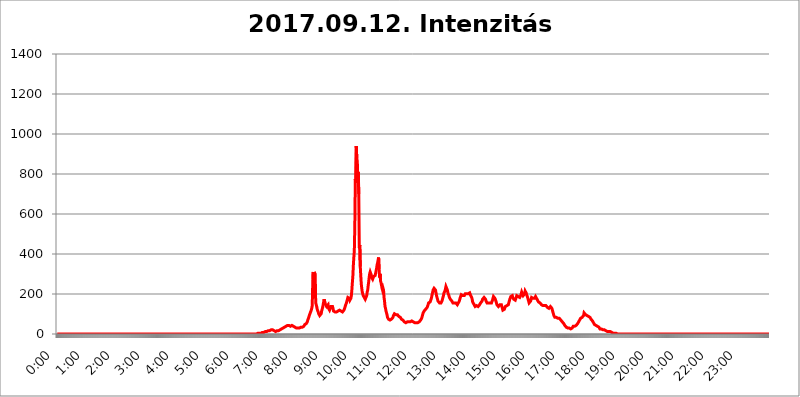
| Category | 2017.09.12. Intenzitás [W/m^2] |
|---|---|
| 0.0 | 0 |
| 0.0006944444444444445 | 0 |
| 0.001388888888888889 | 0 |
| 0.0020833333333333333 | 0 |
| 0.002777777777777778 | 0 |
| 0.003472222222222222 | 0 |
| 0.004166666666666667 | 0 |
| 0.004861111111111111 | 0 |
| 0.005555555555555556 | 0 |
| 0.0062499999999999995 | 0 |
| 0.006944444444444444 | 0 |
| 0.007638888888888889 | 0 |
| 0.008333333333333333 | 0 |
| 0.009027777777777779 | 0 |
| 0.009722222222222222 | 0 |
| 0.010416666666666666 | 0 |
| 0.011111111111111112 | 0 |
| 0.011805555555555555 | 0 |
| 0.012499999999999999 | 0 |
| 0.013194444444444444 | 0 |
| 0.013888888888888888 | 0 |
| 0.014583333333333332 | 0 |
| 0.015277777777777777 | 0 |
| 0.015972222222222224 | 0 |
| 0.016666666666666666 | 0 |
| 0.017361111111111112 | 0 |
| 0.018055555555555557 | 0 |
| 0.01875 | 0 |
| 0.019444444444444445 | 0 |
| 0.02013888888888889 | 0 |
| 0.020833333333333332 | 0 |
| 0.02152777777777778 | 0 |
| 0.022222222222222223 | 0 |
| 0.02291666666666667 | 0 |
| 0.02361111111111111 | 0 |
| 0.024305555555555556 | 0 |
| 0.024999999999999998 | 0 |
| 0.025694444444444447 | 0 |
| 0.02638888888888889 | 0 |
| 0.027083333333333334 | 0 |
| 0.027777777777777776 | 0 |
| 0.02847222222222222 | 0 |
| 0.029166666666666664 | 0 |
| 0.029861111111111113 | 0 |
| 0.030555555555555555 | 0 |
| 0.03125 | 0 |
| 0.03194444444444445 | 0 |
| 0.03263888888888889 | 0 |
| 0.03333333333333333 | 0 |
| 0.034027777777777775 | 0 |
| 0.034722222222222224 | 0 |
| 0.035416666666666666 | 0 |
| 0.036111111111111115 | 0 |
| 0.03680555555555556 | 0 |
| 0.0375 | 0 |
| 0.03819444444444444 | 0 |
| 0.03888888888888889 | 0 |
| 0.03958333333333333 | 0 |
| 0.04027777777777778 | 0 |
| 0.04097222222222222 | 0 |
| 0.041666666666666664 | 0 |
| 0.042361111111111106 | 0 |
| 0.04305555555555556 | 0 |
| 0.043750000000000004 | 0 |
| 0.044444444444444446 | 0 |
| 0.04513888888888889 | 0 |
| 0.04583333333333334 | 0 |
| 0.04652777777777778 | 0 |
| 0.04722222222222222 | 0 |
| 0.04791666666666666 | 0 |
| 0.04861111111111111 | 0 |
| 0.049305555555555554 | 0 |
| 0.049999999999999996 | 0 |
| 0.05069444444444445 | 0 |
| 0.051388888888888894 | 0 |
| 0.052083333333333336 | 0 |
| 0.05277777777777778 | 0 |
| 0.05347222222222222 | 0 |
| 0.05416666666666667 | 0 |
| 0.05486111111111111 | 0 |
| 0.05555555555555555 | 0 |
| 0.05625 | 0 |
| 0.05694444444444444 | 0 |
| 0.057638888888888885 | 0 |
| 0.05833333333333333 | 0 |
| 0.05902777777777778 | 0 |
| 0.059722222222222225 | 0 |
| 0.06041666666666667 | 0 |
| 0.061111111111111116 | 0 |
| 0.06180555555555556 | 0 |
| 0.0625 | 0 |
| 0.06319444444444444 | 0 |
| 0.06388888888888888 | 0 |
| 0.06458333333333334 | 0 |
| 0.06527777777777778 | 0 |
| 0.06597222222222222 | 0 |
| 0.06666666666666667 | 0 |
| 0.06736111111111111 | 0 |
| 0.06805555555555555 | 0 |
| 0.06874999999999999 | 0 |
| 0.06944444444444443 | 0 |
| 0.07013888888888889 | 0 |
| 0.07083333333333333 | 0 |
| 0.07152777777777779 | 0 |
| 0.07222222222222223 | 0 |
| 0.07291666666666667 | 0 |
| 0.07361111111111111 | 0 |
| 0.07430555555555556 | 0 |
| 0.075 | 0 |
| 0.07569444444444444 | 0 |
| 0.0763888888888889 | 0 |
| 0.07708333333333334 | 0 |
| 0.07777777777777778 | 0 |
| 0.07847222222222222 | 0 |
| 0.07916666666666666 | 0 |
| 0.0798611111111111 | 0 |
| 0.08055555555555556 | 0 |
| 0.08125 | 0 |
| 0.08194444444444444 | 0 |
| 0.08263888888888889 | 0 |
| 0.08333333333333333 | 0 |
| 0.08402777777777777 | 0 |
| 0.08472222222222221 | 0 |
| 0.08541666666666665 | 0 |
| 0.08611111111111112 | 0 |
| 0.08680555555555557 | 0 |
| 0.08750000000000001 | 0 |
| 0.08819444444444445 | 0 |
| 0.08888888888888889 | 0 |
| 0.08958333333333333 | 0 |
| 0.09027777777777778 | 0 |
| 0.09097222222222222 | 0 |
| 0.09166666666666667 | 0 |
| 0.09236111111111112 | 0 |
| 0.09305555555555556 | 0 |
| 0.09375 | 0 |
| 0.09444444444444444 | 0 |
| 0.09513888888888888 | 0 |
| 0.09583333333333333 | 0 |
| 0.09652777777777777 | 0 |
| 0.09722222222222222 | 0 |
| 0.09791666666666667 | 0 |
| 0.09861111111111111 | 0 |
| 0.09930555555555555 | 0 |
| 0.09999999999999999 | 0 |
| 0.10069444444444443 | 0 |
| 0.1013888888888889 | 0 |
| 0.10208333333333335 | 0 |
| 0.10277777777777779 | 0 |
| 0.10347222222222223 | 0 |
| 0.10416666666666667 | 0 |
| 0.10486111111111111 | 0 |
| 0.10555555555555556 | 0 |
| 0.10625 | 0 |
| 0.10694444444444444 | 0 |
| 0.1076388888888889 | 0 |
| 0.10833333333333334 | 0 |
| 0.10902777777777778 | 0 |
| 0.10972222222222222 | 0 |
| 0.1111111111111111 | 0 |
| 0.11180555555555556 | 0 |
| 0.11180555555555556 | 0 |
| 0.1125 | 0 |
| 0.11319444444444444 | 0 |
| 0.11388888888888889 | 0 |
| 0.11458333333333333 | 0 |
| 0.11527777777777777 | 0 |
| 0.11597222222222221 | 0 |
| 0.11666666666666665 | 0 |
| 0.1173611111111111 | 0 |
| 0.11805555555555557 | 0 |
| 0.11944444444444445 | 0 |
| 0.12013888888888889 | 0 |
| 0.12083333333333333 | 0 |
| 0.12152777777777778 | 0 |
| 0.12222222222222223 | 0 |
| 0.12291666666666667 | 0 |
| 0.12291666666666667 | 0 |
| 0.12361111111111112 | 0 |
| 0.12430555555555556 | 0 |
| 0.125 | 0 |
| 0.12569444444444444 | 0 |
| 0.12638888888888888 | 0 |
| 0.12708333333333333 | 0 |
| 0.16875 | 0 |
| 0.12847222222222224 | 0 |
| 0.12916666666666668 | 0 |
| 0.12986111111111112 | 0 |
| 0.13055555555555556 | 0 |
| 0.13125 | 0 |
| 0.13194444444444445 | 0 |
| 0.1326388888888889 | 0 |
| 0.13333333333333333 | 0 |
| 0.13402777777777777 | 0 |
| 0.13402777777777777 | 0 |
| 0.13472222222222222 | 0 |
| 0.13541666666666666 | 0 |
| 0.1361111111111111 | 0 |
| 0.13749999999999998 | 0 |
| 0.13819444444444443 | 0 |
| 0.1388888888888889 | 0 |
| 0.13958333333333334 | 0 |
| 0.14027777777777778 | 0 |
| 0.14097222222222222 | 0 |
| 0.14166666666666666 | 0 |
| 0.1423611111111111 | 0 |
| 0.14305555555555557 | 0 |
| 0.14375000000000002 | 0 |
| 0.14444444444444446 | 0 |
| 0.1451388888888889 | 0 |
| 0.1451388888888889 | 0 |
| 0.14652777777777778 | 0 |
| 0.14722222222222223 | 0 |
| 0.14791666666666667 | 0 |
| 0.1486111111111111 | 0 |
| 0.14930555555555555 | 0 |
| 0.15 | 0 |
| 0.15069444444444444 | 0 |
| 0.15138888888888888 | 0 |
| 0.15208333333333332 | 0 |
| 0.15277777777777776 | 0 |
| 0.15347222222222223 | 0 |
| 0.15416666666666667 | 0 |
| 0.15486111111111112 | 0 |
| 0.15555555555555556 | 0 |
| 0.15625 | 0 |
| 0.15694444444444444 | 0 |
| 0.15763888888888888 | 0 |
| 0.15833333333333333 | 0 |
| 0.15902777777777777 | 0 |
| 0.15972222222222224 | 0 |
| 0.16041666666666668 | 0 |
| 0.16111111111111112 | 0 |
| 0.16180555555555556 | 0 |
| 0.1625 | 0 |
| 0.16319444444444445 | 0 |
| 0.1638888888888889 | 0 |
| 0.16458333333333333 | 0 |
| 0.16527777777777777 | 0 |
| 0.16597222222222222 | 0 |
| 0.16666666666666666 | 0 |
| 0.1673611111111111 | 0 |
| 0.16805555555555554 | 0 |
| 0.16874999999999998 | 0 |
| 0.16944444444444443 | 0 |
| 0.17013888888888887 | 0 |
| 0.1708333333333333 | 0 |
| 0.17152777777777775 | 0 |
| 0.17222222222222225 | 0 |
| 0.1729166666666667 | 0 |
| 0.17361111111111113 | 0 |
| 0.17430555555555557 | 0 |
| 0.17500000000000002 | 0 |
| 0.17569444444444446 | 0 |
| 0.1763888888888889 | 0 |
| 0.17708333333333334 | 0 |
| 0.17777777777777778 | 0 |
| 0.17847222222222223 | 0 |
| 0.17916666666666667 | 0 |
| 0.1798611111111111 | 0 |
| 0.18055555555555555 | 0 |
| 0.18125 | 0 |
| 0.18194444444444444 | 0 |
| 0.1826388888888889 | 0 |
| 0.18333333333333335 | 0 |
| 0.1840277777777778 | 0 |
| 0.18472222222222223 | 0 |
| 0.18541666666666667 | 0 |
| 0.18611111111111112 | 0 |
| 0.18680555555555556 | 0 |
| 0.1875 | 0 |
| 0.18819444444444444 | 0 |
| 0.18888888888888888 | 0 |
| 0.18958333333333333 | 0 |
| 0.19027777777777777 | 0 |
| 0.1909722222222222 | 0 |
| 0.19166666666666665 | 0 |
| 0.19236111111111112 | 0 |
| 0.19305555555555554 | 0 |
| 0.19375 | 0 |
| 0.19444444444444445 | 0 |
| 0.1951388888888889 | 0 |
| 0.19583333333333333 | 0 |
| 0.19652777777777777 | 0 |
| 0.19722222222222222 | 0 |
| 0.19791666666666666 | 0 |
| 0.1986111111111111 | 0 |
| 0.19930555555555554 | 0 |
| 0.19999999999999998 | 0 |
| 0.20069444444444443 | 0 |
| 0.20138888888888887 | 0 |
| 0.2020833333333333 | 0 |
| 0.2027777777777778 | 0 |
| 0.2034722222222222 | 0 |
| 0.2041666666666667 | 0 |
| 0.20486111111111113 | 0 |
| 0.20555555555555557 | 0 |
| 0.20625000000000002 | 0 |
| 0.20694444444444446 | 0 |
| 0.2076388888888889 | 0 |
| 0.20833333333333334 | 0 |
| 0.20902777777777778 | 0 |
| 0.20972222222222223 | 0 |
| 0.21041666666666667 | 0 |
| 0.2111111111111111 | 0 |
| 0.21180555555555555 | 0 |
| 0.2125 | 0 |
| 0.21319444444444444 | 0 |
| 0.2138888888888889 | 0 |
| 0.21458333333333335 | 0 |
| 0.2152777777777778 | 0 |
| 0.21597222222222223 | 0 |
| 0.21666666666666667 | 0 |
| 0.21736111111111112 | 0 |
| 0.21805555555555556 | 0 |
| 0.21875 | 0 |
| 0.21944444444444444 | 0 |
| 0.22013888888888888 | 0 |
| 0.22083333333333333 | 0 |
| 0.22152777777777777 | 0 |
| 0.2222222222222222 | 0 |
| 0.22291666666666665 | 0 |
| 0.2236111111111111 | 0 |
| 0.22430555555555556 | 0 |
| 0.225 | 0 |
| 0.22569444444444445 | 0 |
| 0.2263888888888889 | 0 |
| 0.22708333333333333 | 0 |
| 0.22777777777777777 | 0 |
| 0.22847222222222222 | 0 |
| 0.22916666666666666 | 0 |
| 0.2298611111111111 | 0 |
| 0.23055555555555554 | 0 |
| 0.23124999999999998 | 0 |
| 0.23194444444444443 | 0 |
| 0.23263888888888887 | 0 |
| 0.2333333333333333 | 0 |
| 0.2340277777777778 | 0 |
| 0.2347222222222222 | 0 |
| 0.2354166666666667 | 0 |
| 0.23611111111111113 | 0 |
| 0.23680555555555557 | 0 |
| 0.23750000000000002 | 0 |
| 0.23819444444444446 | 0 |
| 0.2388888888888889 | 0 |
| 0.23958333333333334 | 0 |
| 0.24027777777777778 | 0 |
| 0.24097222222222223 | 0 |
| 0.24166666666666667 | 0 |
| 0.2423611111111111 | 0 |
| 0.24305555555555555 | 0 |
| 0.24375 | 0 |
| 0.24444444444444446 | 0 |
| 0.24513888888888888 | 0 |
| 0.24583333333333335 | 0 |
| 0.2465277777777778 | 0 |
| 0.24722222222222223 | 0 |
| 0.24791666666666667 | 0 |
| 0.24861111111111112 | 0 |
| 0.24930555555555556 | 0 |
| 0.25 | 0 |
| 0.25069444444444444 | 0 |
| 0.2513888888888889 | 0 |
| 0.2520833333333333 | 0 |
| 0.25277777777777777 | 0 |
| 0.2534722222222222 | 0 |
| 0.25416666666666665 | 0 |
| 0.2548611111111111 | 0 |
| 0.2555555555555556 | 0 |
| 0.25625000000000003 | 0 |
| 0.2569444444444445 | 0 |
| 0.2576388888888889 | 0 |
| 0.25833333333333336 | 0 |
| 0.2590277777777778 | 0 |
| 0.25972222222222224 | 0 |
| 0.2604166666666667 | 0 |
| 0.2611111111111111 | 0 |
| 0.26180555555555557 | 0 |
| 0.2625 | 0 |
| 0.26319444444444445 | 0 |
| 0.2638888888888889 | 0 |
| 0.26458333333333334 | 0 |
| 0.2652777777777778 | 0 |
| 0.2659722222222222 | 0 |
| 0.26666666666666666 | 0 |
| 0.2673611111111111 | 0 |
| 0.26805555555555555 | 0 |
| 0.26875 | 0 |
| 0.26944444444444443 | 0 |
| 0.2701388888888889 | 0 |
| 0.2708333333333333 | 0 |
| 0.27152777777777776 | 0 |
| 0.2722222222222222 | 0 |
| 0.27291666666666664 | 0 |
| 0.2736111111111111 | 0 |
| 0.2743055555555555 | 0 |
| 0.27499999999999997 | 0 |
| 0.27569444444444446 | 0 |
| 0.27638888888888885 | 0 |
| 0.27708333333333335 | 0 |
| 0.2777777777777778 | 0 |
| 0.27847222222222223 | 3.525 |
| 0.2791666666666667 | 0 |
| 0.2798611111111111 | 3.525 |
| 0.28055555555555556 | 3.525 |
| 0.28125 | 3.525 |
| 0.28194444444444444 | 3.525 |
| 0.2826388888888889 | 3.525 |
| 0.2833333333333333 | 3.525 |
| 0.28402777777777777 | 3.525 |
| 0.2847222222222222 | 3.525 |
| 0.28541666666666665 | 3.525 |
| 0.28611111111111115 | 7.887 |
| 0.28680555555555554 | 7.887 |
| 0.28750000000000003 | 7.887 |
| 0.2881944444444445 | 7.887 |
| 0.2888888888888889 | 7.887 |
| 0.28958333333333336 | 7.887 |
| 0.2902777777777778 | 12.257 |
| 0.29097222222222224 | 12.257 |
| 0.2916666666666667 | 12.257 |
| 0.2923611111111111 | 12.257 |
| 0.29305555555555557 | 12.257 |
| 0.29375 | 12.257 |
| 0.29444444444444445 | 12.257 |
| 0.2951388888888889 | 12.257 |
| 0.29583333333333334 | 16.636 |
| 0.2965277777777778 | 16.636 |
| 0.2972222222222222 | 16.636 |
| 0.29791666666666666 | 16.636 |
| 0.2986111111111111 | 21.024 |
| 0.29930555555555555 | 21.024 |
| 0.3 | 21.024 |
| 0.30069444444444443 | 21.024 |
| 0.3013888888888889 | 21.024 |
| 0.3020833333333333 | 21.024 |
| 0.30277777777777776 | 21.024 |
| 0.3034722222222222 | 16.636 |
| 0.30416666666666664 | 16.636 |
| 0.3048611111111111 | 16.636 |
| 0.3055555555555555 | 12.257 |
| 0.30624999999999997 | 12.257 |
| 0.3069444444444444 | 12.257 |
| 0.3076388888888889 | 12.257 |
| 0.30833333333333335 | 16.636 |
| 0.3090277777777778 | 16.636 |
| 0.30972222222222223 | 16.636 |
| 0.3104166666666667 | 16.636 |
| 0.3111111111111111 | 16.636 |
| 0.31180555555555556 | 21.024 |
| 0.3125 | 21.024 |
| 0.31319444444444444 | 21.024 |
| 0.3138888888888889 | 21.024 |
| 0.3145833333333333 | 25.419 |
| 0.31527777777777777 | 25.419 |
| 0.3159722222222222 | 29.823 |
| 0.31666666666666665 | 29.823 |
| 0.31736111111111115 | 29.823 |
| 0.31805555555555554 | 34.234 |
| 0.31875000000000003 | 34.234 |
| 0.3194444444444445 | 38.653 |
| 0.3201388888888889 | 38.653 |
| 0.32083333333333336 | 38.653 |
| 0.3215277777777778 | 38.653 |
| 0.32222222222222224 | 38.653 |
| 0.3229166666666667 | 43.079 |
| 0.3236111111111111 | 43.079 |
| 0.32430555555555557 | 43.079 |
| 0.325 | 43.079 |
| 0.32569444444444445 | 43.079 |
| 0.3263888888888889 | 38.653 |
| 0.32708333333333334 | 38.653 |
| 0.3277777777777778 | 38.653 |
| 0.3284722222222222 | 43.079 |
| 0.32916666666666666 | 43.079 |
| 0.3298611111111111 | 47.511 |
| 0.33055555555555555 | 43.079 |
| 0.33125 | 38.653 |
| 0.33194444444444443 | 38.653 |
| 0.3326388888888889 | 38.653 |
| 0.3333333333333333 | 34.234 |
| 0.3340277777777778 | 34.234 |
| 0.3347222222222222 | 34.234 |
| 0.3354166666666667 | 29.823 |
| 0.3361111111111111 | 29.823 |
| 0.3368055555555556 | 29.823 |
| 0.33749999999999997 | 29.823 |
| 0.33819444444444446 | 25.419 |
| 0.33888888888888885 | 25.419 |
| 0.33958333333333335 | 29.823 |
| 0.34027777777777773 | 29.823 |
| 0.34097222222222223 | 34.234 |
| 0.3416666666666666 | 34.234 |
| 0.3423611111111111 | 34.234 |
| 0.3430555555555555 | 34.234 |
| 0.34375 | 34.234 |
| 0.3444444444444445 | 34.234 |
| 0.3451388888888889 | 38.653 |
| 0.3458333333333334 | 38.653 |
| 0.34652777777777777 | 43.079 |
| 0.34722222222222227 | 47.511 |
| 0.34791666666666665 | 47.511 |
| 0.34861111111111115 | 47.511 |
| 0.34930555555555554 | 51.951 |
| 0.35000000000000003 | 56.398 |
| 0.3506944444444444 | 60.85 |
| 0.3513888888888889 | 69.775 |
| 0.3520833333333333 | 74.246 |
| 0.3527777777777778 | 83.205 |
| 0.3534722222222222 | 92.184 |
| 0.3541666666666667 | 96.682 |
| 0.3548611111111111 | 105.69 |
| 0.35555555555555557 | 110.201 |
| 0.35625 | 119.235 |
| 0.35694444444444445 | 128.284 |
| 0.3576388888888889 | 141.884 |
| 0.35833333333333334 | 255.813 |
| 0.3590277777777778 | 310.44 |
| 0.3597222222222222 | 182.82 |
| 0.36041666666666666 | 310.44 |
| 0.3611111111111111 | 305.898 |
| 0.36180555555555555 | 296.808 |
| 0.3625 | 155.509 |
| 0.36319444444444443 | 146.423 |
| 0.3638888888888889 | 137.347 |
| 0.3645833333333333 | 123.758 |
| 0.3652777777777778 | 119.235 |
| 0.3659722222222222 | 110.201 |
| 0.3666666666666667 | 101.184 |
| 0.3673611111111111 | 101.184 |
| 0.3680555555555556 | 92.184 |
| 0.36874999999999997 | 92.184 |
| 0.36944444444444446 | 96.682 |
| 0.37013888888888885 | 101.184 |
| 0.37083333333333335 | 114.716 |
| 0.37152777777777773 | 123.758 |
| 0.37222222222222223 | 132.814 |
| 0.3729166666666666 | 146.423 |
| 0.3736111111111111 | 160.056 |
| 0.3743055555555555 | 173.709 |
| 0.375 | 164.605 |
| 0.3756944444444445 | 155.509 |
| 0.3763888888888889 | 146.423 |
| 0.3770833333333334 | 141.884 |
| 0.37777777777777777 | 137.347 |
| 0.37847222222222227 | 137.347 |
| 0.37916666666666665 | 141.884 |
| 0.37986111111111115 | 146.423 |
| 0.38055555555555554 | 128.284 |
| 0.38125000000000003 | 123.758 |
| 0.3819444444444444 | 119.235 |
| 0.3826388888888889 | 119.235 |
| 0.3833333333333333 | 123.758 |
| 0.3840277777777778 | 137.347 |
| 0.3847222222222222 | 141.884 |
| 0.3854166666666667 | 141.884 |
| 0.3861111111111111 | 137.347 |
| 0.38680555555555557 | 128.284 |
| 0.3875 | 114.716 |
| 0.38819444444444445 | 110.201 |
| 0.3888888888888889 | 110.201 |
| 0.38958333333333334 | 110.201 |
| 0.3902777777777778 | 110.201 |
| 0.3909722222222222 | 110.201 |
| 0.39166666666666666 | 110.201 |
| 0.3923611111111111 | 114.716 |
| 0.39305555555555555 | 114.716 |
| 0.39375 | 114.716 |
| 0.39444444444444443 | 119.235 |
| 0.3951388888888889 | 119.235 |
| 0.3958333333333333 | 119.235 |
| 0.3965277777777778 | 119.235 |
| 0.3972222222222222 | 114.716 |
| 0.3979166666666667 | 114.716 |
| 0.3986111111111111 | 110.201 |
| 0.3993055555555556 | 110.201 |
| 0.39999999999999997 | 110.201 |
| 0.40069444444444446 | 114.716 |
| 0.40138888888888885 | 114.716 |
| 0.40208333333333335 | 119.235 |
| 0.40277777777777773 | 123.758 |
| 0.40347222222222223 | 132.814 |
| 0.4041666666666666 | 141.884 |
| 0.4048611111111111 | 146.423 |
| 0.4055555555555555 | 155.509 |
| 0.40625 | 160.056 |
| 0.4069444444444445 | 173.709 |
| 0.4076388888888889 | 182.82 |
| 0.4083333333333334 | 187.378 |
| 0.40902777777777777 | 187.378 |
| 0.40972222222222227 | 178.264 |
| 0.41041666666666665 | 169.156 |
| 0.41111111111111115 | 169.156 |
| 0.41180555555555554 | 178.264 |
| 0.41250000000000003 | 191.937 |
| 0.4131944444444444 | 219.309 |
| 0.4138888888888889 | 255.813 |
| 0.4145833333333333 | 287.709 |
| 0.4152777777777778 | 342.162 |
| 0.4159722222222222 | 382.715 |
| 0.4166666666666667 | 418.492 |
| 0.4173611111111111 | 541.121 |
| 0.41805555555555557 | 775.492 |
| 0.41875 | 755.766 |
| 0.41944444444444445 | 940.082 |
| 0.4201388888888889 | 875.918 |
| 0.42083333333333334 | 864.493 |
| 0.4215277777777778 | 775.492 |
| 0.4222222222222222 | 810.641 |
| 0.42291666666666666 | 699.717 |
| 0.4236111111111111 | 431.833 |
| 0.42430555555555555 | 445.129 |
| 0.425 | 337.639 |
| 0.42569444444444443 | 292.259 |
| 0.4263888888888889 | 251.251 |
| 0.4270833333333333 | 228.436 |
| 0.4277777777777778 | 210.182 |
| 0.4284722222222222 | 201.058 |
| 0.4291666666666667 | 191.937 |
| 0.4298611111111111 | 187.378 |
| 0.4305555555555556 | 182.82 |
| 0.43124999999999997 | 178.264 |
| 0.43194444444444446 | 173.709 |
| 0.43263888888888885 | 173.709 |
| 0.43333333333333335 | 178.264 |
| 0.43402777777777773 | 191.937 |
| 0.43472222222222223 | 210.182 |
| 0.4354166666666666 | 219.309 |
| 0.4361111111111111 | 242.127 |
| 0.4368055555555555 | 260.373 |
| 0.4375 | 283.156 |
| 0.4381944444444445 | 301.354 |
| 0.4388888888888889 | 310.44 |
| 0.4395833333333334 | 310.44 |
| 0.44027777777777777 | 296.808 |
| 0.44097222222222227 | 283.156 |
| 0.44166666666666665 | 278.603 |
| 0.44236111111111115 | 274.047 |
| 0.44305555555555554 | 278.603 |
| 0.44375000000000003 | 287.709 |
| 0.4444444444444444 | 292.259 |
| 0.4451388888888889 | 292.259 |
| 0.4458333333333333 | 292.259 |
| 0.4465277777777778 | 292.259 |
| 0.4472222222222222 | 296.808 |
| 0.4479166666666667 | 328.584 |
| 0.4486111111111111 | 346.682 |
| 0.44930555555555557 | 355.712 |
| 0.45 | 369.23 |
| 0.45069444444444445 | 382.715 |
| 0.4513888888888889 | 324.052 |
| 0.45208333333333334 | 283.156 |
| 0.4527777777777778 | 301.354 |
| 0.4534722222222222 | 264.932 |
| 0.45416666666666666 | 255.813 |
| 0.4548611111111111 | 242.127 |
| 0.45555555555555555 | 228.436 |
| 0.45625 | 219.309 |
| 0.45694444444444443 | 228.436 |
| 0.4576388888888889 | 219.309 |
| 0.4583333333333333 | 182.82 |
| 0.4590277777777778 | 164.605 |
| 0.4597222222222222 | 137.347 |
| 0.4604166666666667 | 128.284 |
| 0.4611111111111111 | 114.716 |
| 0.4618055555555556 | 105.69 |
| 0.46249999999999997 | 96.682 |
| 0.46319444444444446 | 83.205 |
| 0.46388888888888885 | 78.722 |
| 0.46458333333333335 | 74.246 |
| 0.46527777777777773 | 69.775 |
| 0.46597222222222223 | 69.775 |
| 0.4666666666666666 | 69.775 |
| 0.4673611111111111 | 69.775 |
| 0.4680555555555555 | 69.775 |
| 0.46875 | 74.246 |
| 0.4694444444444445 | 74.246 |
| 0.4701388888888889 | 78.722 |
| 0.4708333333333334 | 83.205 |
| 0.47152777777777777 | 92.184 |
| 0.47222222222222227 | 96.682 |
| 0.47291666666666665 | 101.184 |
| 0.47361111111111115 | 101.184 |
| 0.47430555555555554 | 101.184 |
| 0.47500000000000003 | 96.682 |
| 0.4756944444444444 | 96.682 |
| 0.4763888888888889 | 96.682 |
| 0.4770833333333333 | 96.682 |
| 0.4777777777777778 | 92.184 |
| 0.4784722222222222 | 92.184 |
| 0.4791666666666667 | 87.692 |
| 0.4798611111111111 | 83.205 |
| 0.48055555555555557 | 83.205 |
| 0.48125 | 83.205 |
| 0.48194444444444445 | 78.722 |
| 0.4826388888888889 | 74.246 |
| 0.48333333333333334 | 74.246 |
| 0.4840277777777778 | 69.775 |
| 0.4847222222222222 | 69.775 |
| 0.48541666666666666 | 65.31 |
| 0.4861111111111111 | 65.31 |
| 0.48680555555555555 | 60.85 |
| 0.4875 | 60.85 |
| 0.48819444444444443 | 60.85 |
| 0.4888888888888889 | 56.398 |
| 0.4895833333333333 | 56.398 |
| 0.4902777777777778 | 60.85 |
| 0.4909722222222222 | 60.85 |
| 0.4916666666666667 | 60.85 |
| 0.4923611111111111 | 60.85 |
| 0.4930555555555556 | 60.85 |
| 0.49374999999999997 | 60.85 |
| 0.49444444444444446 | 60.85 |
| 0.49513888888888885 | 60.85 |
| 0.49583333333333335 | 60.85 |
| 0.49652777777777773 | 65.31 |
| 0.49722222222222223 | 65.31 |
| 0.4979166666666666 | 65.31 |
| 0.4986111111111111 | 60.85 |
| 0.4993055555555555 | 60.85 |
| 0.5 | 60.85 |
| 0.5006944444444444 | 56.398 |
| 0.5013888888888889 | 56.398 |
| 0.5020833333333333 | 56.398 |
| 0.5027777777777778 | 56.398 |
| 0.5034722222222222 | 56.398 |
| 0.5041666666666667 | 56.398 |
| 0.5048611111111111 | 51.951 |
| 0.5055555555555555 | 56.398 |
| 0.50625 | 56.398 |
| 0.5069444444444444 | 56.398 |
| 0.5076388888888889 | 60.85 |
| 0.5083333333333333 | 60.85 |
| 0.5090277777777777 | 65.31 |
| 0.5097222222222222 | 69.775 |
| 0.5104166666666666 | 74.246 |
| 0.5111111111111112 | 78.722 |
| 0.5118055555555555 | 87.692 |
| 0.5125000000000001 | 96.682 |
| 0.5131944444444444 | 105.69 |
| 0.513888888888889 | 110.201 |
| 0.5145833333333333 | 114.716 |
| 0.5152777777777778 | 119.235 |
| 0.5159722222222222 | 119.235 |
| 0.5166666666666667 | 123.758 |
| 0.517361111111111 | 123.758 |
| 0.5180555555555556 | 128.284 |
| 0.5187499999999999 | 132.814 |
| 0.5194444444444445 | 137.347 |
| 0.5201388888888888 | 146.423 |
| 0.5208333333333334 | 155.509 |
| 0.5215277777777778 | 155.509 |
| 0.5222222222222223 | 155.509 |
| 0.5229166666666667 | 160.056 |
| 0.5236111111111111 | 164.605 |
| 0.5243055555555556 | 173.709 |
| 0.525 | 182.82 |
| 0.5256944444444445 | 196.497 |
| 0.5263888888888889 | 205.62 |
| 0.5270833333333333 | 219.309 |
| 0.5277777777777778 | 223.873 |
| 0.5284722222222222 | 228.436 |
| 0.5291666666666667 | 228.436 |
| 0.5298611111111111 | 223.873 |
| 0.5305555555555556 | 219.309 |
| 0.53125 | 205.62 |
| 0.5319444444444444 | 191.937 |
| 0.5326388888888889 | 182.82 |
| 0.5333333333333333 | 173.709 |
| 0.5340277777777778 | 164.605 |
| 0.5347222222222222 | 164.605 |
| 0.5354166666666667 | 160.056 |
| 0.5361111111111111 | 155.509 |
| 0.5368055555555555 | 155.509 |
| 0.5375 | 150.964 |
| 0.5381944444444444 | 155.509 |
| 0.5388888888888889 | 160.056 |
| 0.5395833333333333 | 164.605 |
| 0.5402777777777777 | 173.709 |
| 0.5409722222222222 | 182.82 |
| 0.5416666666666666 | 191.937 |
| 0.5423611111111112 | 205.62 |
| 0.5430555555555555 | 210.182 |
| 0.5437500000000001 | 214.746 |
| 0.5444444444444444 | 219.309 |
| 0.545138888888889 | 237.564 |
| 0.5458333333333333 | 242.127 |
| 0.5465277777777778 | 233 |
| 0.5472222222222222 | 219.309 |
| 0.5479166666666667 | 205.62 |
| 0.548611111111111 | 201.058 |
| 0.5493055555555556 | 191.937 |
| 0.5499999999999999 | 182.82 |
| 0.5506944444444445 | 178.264 |
| 0.5513888888888888 | 173.709 |
| 0.5520833333333334 | 173.709 |
| 0.5527777777777778 | 169.156 |
| 0.5534722222222223 | 164.605 |
| 0.5541666666666667 | 160.056 |
| 0.5548611111111111 | 155.509 |
| 0.5555555555555556 | 155.509 |
| 0.55625 | 155.509 |
| 0.5569444444444445 | 155.509 |
| 0.5576388888888889 | 160.056 |
| 0.5583333333333333 | 160.056 |
| 0.5590277777777778 | 155.509 |
| 0.5597222222222222 | 150.964 |
| 0.5604166666666667 | 150.964 |
| 0.5611111111111111 | 146.423 |
| 0.5618055555555556 | 150.964 |
| 0.5625 | 155.509 |
| 0.5631944444444444 | 160.056 |
| 0.5638888888888889 | 164.605 |
| 0.5645833333333333 | 173.709 |
| 0.5652777777777778 | 182.82 |
| 0.5659722222222222 | 187.378 |
| 0.5666666666666667 | 196.497 |
| 0.5673611111111111 | 201.058 |
| 0.5680555555555555 | 196.497 |
| 0.56875 | 191.937 |
| 0.5694444444444444 | 187.378 |
| 0.5701388888888889 | 187.378 |
| 0.5708333333333333 | 191.937 |
| 0.5715277777777777 | 196.497 |
| 0.5722222222222222 | 201.058 |
| 0.5729166666666666 | 201.058 |
| 0.5736111111111112 | 201.058 |
| 0.5743055555555555 | 201.058 |
| 0.5750000000000001 | 205.62 |
| 0.5756944444444444 | 205.62 |
| 0.576388888888889 | 201.058 |
| 0.5770833333333333 | 196.497 |
| 0.5777777777777778 | 201.058 |
| 0.5784722222222222 | 205.62 |
| 0.5791666666666667 | 201.058 |
| 0.579861111111111 | 191.937 |
| 0.5805555555555556 | 191.937 |
| 0.5812499999999999 | 182.82 |
| 0.5819444444444445 | 173.709 |
| 0.5826388888888888 | 160.056 |
| 0.5833333333333334 | 155.509 |
| 0.5840277777777778 | 150.964 |
| 0.5847222222222223 | 146.423 |
| 0.5854166666666667 | 146.423 |
| 0.5861111111111111 | 137.347 |
| 0.5868055555555556 | 137.347 |
| 0.5875 | 141.884 |
| 0.5881944444444445 | 141.884 |
| 0.5888888888888889 | 141.884 |
| 0.5895833333333333 | 141.884 |
| 0.5902777777777778 | 137.347 |
| 0.5909722222222222 | 137.347 |
| 0.5916666666666667 | 141.884 |
| 0.5923611111111111 | 146.423 |
| 0.5930555555555556 | 150.964 |
| 0.59375 | 155.509 |
| 0.5944444444444444 | 155.509 |
| 0.5951388888888889 | 160.056 |
| 0.5958333333333333 | 164.605 |
| 0.5965277777777778 | 173.709 |
| 0.5972222222222222 | 178.264 |
| 0.5979166666666667 | 178.264 |
| 0.5986111111111111 | 182.82 |
| 0.5993055555555555 | 187.378 |
| 0.6 | 182.82 |
| 0.6006944444444444 | 173.709 |
| 0.6013888888888889 | 164.605 |
| 0.6020833333333333 | 160.056 |
| 0.6027777777777777 | 155.509 |
| 0.6034722222222222 | 150.964 |
| 0.6041666666666666 | 155.509 |
| 0.6048611111111112 | 155.509 |
| 0.6055555555555555 | 160.056 |
| 0.6062500000000001 | 155.509 |
| 0.6069444444444444 | 155.509 |
| 0.607638888888889 | 150.964 |
| 0.6083333333333333 | 155.509 |
| 0.6090277777777778 | 155.509 |
| 0.6097222222222222 | 160.056 |
| 0.6104166666666667 | 169.156 |
| 0.611111111111111 | 173.709 |
| 0.6118055555555556 | 187.378 |
| 0.6124999999999999 | 191.937 |
| 0.6131944444444445 | 182.82 |
| 0.6138888888888888 | 178.264 |
| 0.6145833333333334 | 173.709 |
| 0.6152777777777778 | 164.605 |
| 0.6159722222222223 | 155.509 |
| 0.6166666666666667 | 146.423 |
| 0.6173611111111111 | 141.884 |
| 0.6180555555555556 | 141.884 |
| 0.61875 | 137.347 |
| 0.6194444444444445 | 137.347 |
| 0.6201388888888889 | 141.884 |
| 0.6208333333333333 | 146.423 |
| 0.6215277777777778 | 150.964 |
| 0.6222222222222222 | 150.964 |
| 0.6229166666666667 | 146.423 |
| 0.6236111111111111 | 137.347 |
| 0.6243055555555556 | 128.284 |
| 0.625 | 119.235 |
| 0.6256944444444444 | 119.235 |
| 0.6263888888888889 | 119.235 |
| 0.6270833333333333 | 123.758 |
| 0.6277777777777778 | 128.284 |
| 0.6284722222222222 | 137.347 |
| 0.6291666666666667 | 141.884 |
| 0.6298611111111111 | 141.884 |
| 0.6305555555555555 | 141.884 |
| 0.63125 | 141.884 |
| 0.6319444444444444 | 141.884 |
| 0.6326388888888889 | 146.423 |
| 0.6333333333333333 | 155.509 |
| 0.6340277777777777 | 164.605 |
| 0.6347222222222222 | 173.709 |
| 0.6354166666666666 | 178.264 |
| 0.6361111111111112 | 187.378 |
| 0.6368055555555555 | 191.937 |
| 0.6375000000000001 | 191.937 |
| 0.6381944444444444 | 191.937 |
| 0.638888888888889 | 182.82 |
| 0.6395833333333333 | 178.264 |
| 0.6402777777777778 | 173.709 |
| 0.6409722222222222 | 169.156 |
| 0.6416666666666667 | 169.156 |
| 0.642361111111111 | 169.156 |
| 0.6430555555555556 | 173.709 |
| 0.6437499999999999 | 182.82 |
| 0.6444444444444445 | 191.937 |
| 0.6451388888888888 | 196.497 |
| 0.6458333333333334 | 191.937 |
| 0.6465277777777778 | 187.378 |
| 0.6472222222222223 | 182.82 |
| 0.6479166666666667 | 182.82 |
| 0.6486111111111111 | 182.82 |
| 0.6493055555555556 | 182.82 |
| 0.65 | 191.937 |
| 0.6506944444444445 | 201.058 |
| 0.6513888888888889 | 210.182 |
| 0.6520833333333333 | 210.182 |
| 0.6527777777777778 | 205.62 |
| 0.6534722222222222 | 191.937 |
| 0.6541666666666667 | 187.378 |
| 0.6548611111111111 | 187.378 |
| 0.6555555555555556 | 201.058 |
| 0.65625 | 214.746 |
| 0.6569444444444444 | 214.746 |
| 0.6576388888888889 | 205.62 |
| 0.6583333333333333 | 196.497 |
| 0.6590277777777778 | 191.937 |
| 0.6597222222222222 | 182.82 |
| 0.6604166666666667 | 173.709 |
| 0.6611111111111111 | 164.605 |
| 0.6618055555555555 | 155.509 |
| 0.6625 | 155.509 |
| 0.6631944444444444 | 155.509 |
| 0.6638888888888889 | 164.605 |
| 0.6645833333333333 | 173.709 |
| 0.6652777777777777 | 182.82 |
| 0.6659722222222222 | 178.264 |
| 0.6666666666666666 | 178.264 |
| 0.6673611111111111 | 178.264 |
| 0.6680555555555556 | 173.709 |
| 0.6687500000000001 | 173.709 |
| 0.6694444444444444 | 178.264 |
| 0.6701388888888888 | 182.82 |
| 0.6708333333333334 | 187.378 |
| 0.6715277777777778 | 187.378 |
| 0.6722222222222222 | 178.264 |
| 0.6729166666666666 | 173.709 |
| 0.6736111111111112 | 169.156 |
| 0.6743055555555556 | 164.605 |
| 0.6749999999999999 | 160.056 |
| 0.6756944444444444 | 155.509 |
| 0.6763888888888889 | 155.509 |
| 0.6770833333333334 | 155.509 |
| 0.6777777777777777 | 155.509 |
| 0.6784722222222223 | 150.964 |
| 0.6791666666666667 | 146.423 |
| 0.6798611111111111 | 141.884 |
| 0.6805555555555555 | 141.884 |
| 0.68125 | 141.884 |
| 0.6819444444444445 | 141.884 |
| 0.6826388888888889 | 141.884 |
| 0.6833333333333332 | 141.884 |
| 0.6840277777777778 | 141.884 |
| 0.6847222222222222 | 141.884 |
| 0.6854166666666667 | 141.884 |
| 0.686111111111111 | 146.423 |
| 0.6868055555555556 | 141.884 |
| 0.6875 | 132.814 |
| 0.6881944444444444 | 128.284 |
| 0.688888888888889 | 128.284 |
| 0.6895833333333333 | 128.284 |
| 0.6902777777777778 | 128.284 |
| 0.6909722222222222 | 132.814 |
| 0.6916666666666668 | 137.347 |
| 0.6923611111111111 | 137.347 |
| 0.6930555555555555 | 132.814 |
| 0.69375 | 128.284 |
| 0.6944444444444445 | 119.235 |
| 0.6951388888888889 | 110.201 |
| 0.6958333333333333 | 101.184 |
| 0.6965277777777777 | 92.184 |
| 0.6972222222222223 | 87.692 |
| 0.6979166666666666 | 83.205 |
| 0.6986111111111111 | 83.205 |
| 0.6993055555555556 | 83.205 |
| 0.7000000000000001 | 83.205 |
| 0.7006944444444444 | 83.205 |
| 0.7013888888888888 | 83.205 |
| 0.7020833333333334 | 78.722 |
| 0.7027777777777778 | 78.722 |
| 0.7034722222222222 | 78.722 |
| 0.7041666666666666 | 78.722 |
| 0.7048611111111112 | 74.246 |
| 0.7055555555555556 | 74.246 |
| 0.7062499999999999 | 69.775 |
| 0.7069444444444444 | 65.31 |
| 0.7076388888888889 | 65.31 |
| 0.7083333333333334 | 60.85 |
| 0.7090277777777777 | 60.85 |
| 0.7097222222222223 | 56.398 |
| 0.7104166666666667 | 51.951 |
| 0.7111111111111111 | 47.511 |
| 0.7118055555555555 | 43.079 |
| 0.7125 | 38.653 |
| 0.7131944444444445 | 38.653 |
| 0.7138888888888889 | 34.234 |
| 0.7145833333333332 | 34.234 |
| 0.7152777777777778 | 29.823 |
| 0.7159722222222222 | 29.823 |
| 0.7166666666666667 | 29.823 |
| 0.717361111111111 | 29.823 |
| 0.7180555555555556 | 29.823 |
| 0.71875 | 25.419 |
| 0.7194444444444444 | 25.419 |
| 0.720138888888889 | 25.419 |
| 0.7208333333333333 | 25.419 |
| 0.7215277777777778 | 29.823 |
| 0.7222222222222222 | 29.823 |
| 0.7229166666666668 | 34.234 |
| 0.7236111111111111 | 38.653 |
| 0.7243055555555555 | 38.653 |
| 0.725 | 38.653 |
| 0.7256944444444445 | 38.653 |
| 0.7263888888888889 | 43.079 |
| 0.7270833333333333 | 43.079 |
| 0.7277777777777777 | 43.079 |
| 0.7284722222222223 | 43.079 |
| 0.7291666666666666 | 47.511 |
| 0.7298611111111111 | 51.951 |
| 0.7305555555555556 | 56.398 |
| 0.7312500000000001 | 60.85 |
| 0.7319444444444444 | 65.31 |
| 0.7326388888888888 | 69.775 |
| 0.7333333333333334 | 74.246 |
| 0.7340277777777778 | 78.722 |
| 0.7347222222222222 | 83.205 |
| 0.7354166666666666 | 83.205 |
| 0.7361111111111112 | 83.205 |
| 0.7368055555555556 | 83.205 |
| 0.7374999999999999 | 83.205 |
| 0.7381944444444444 | 92.184 |
| 0.7388888888888889 | 105.69 |
| 0.7395833333333334 | 105.69 |
| 0.7402777777777777 | 101.184 |
| 0.7409722222222223 | 96.682 |
| 0.7416666666666667 | 92.184 |
| 0.7423611111111111 | 92.184 |
| 0.7430555555555555 | 92.184 |
| 0.74375 | 92.184 |
| 0.7444444444444445 | 92.184 |
| 0.7451388888888889 | 87.692 |
| 0.7458333333333332 | 87.692 |
| 0.7465277777777778 | 83.205 |
| 0.7472222222222222 | 83.205 |
| 0.7479166666666667 | 78.722 |
| 0.748611111111111 | 74.246 |
| 0.7493055555555556 | 74.246 |
| 0.75 | 69.775 |
| 0.7506944444444444 | 65.31 |
| 0.751388888888889 | 60.85 |
| 0.7520833333333333 | 56.398 |
| 0.7527777777777778 | 51.951 |
| 0.7534722222222222 | 47.511 |
| 0.7541666666666668 | 47.511 |
| 0.7548611111111111 | 43.079 |
| 0.7555555555555555 | 43.079 |
| 0.75625 | 38.653 |
| 0.7569444444444445 | 38.653 |
| 0.7576388888888889 | 38.653 |
| 0.7583333333333333 | 34.234 |
| 0.7590277777777777 | 34.234 |
| 0.7597222222222223 | 34.234 |
| 0.7604166666666666 | 29.823 |
| 0.7611111111111111 | 25.419 |
| 0.7618055555555556 | 25.419 |
| 0.7625000000000001 | 25.419 |
| 0.7631944444444444 | 25.419 |
| 0.7638888888888888 | 25.419 |
| 0.7645833333333334 | 25.419 |
| 0.7652777777777778 | 21.024 |
| 0.7659722222222222 | 21.024 |
| 0.7666666666666666 | 21.024 |
| 0.7673611111111112 | 21.024 |
| 0.7680555555555556 | 21.024 |
| 0.7687499999999999 | 16.636 |
| 0.7694444444444444 | 16.636 |
| 0.7701388888888889 | 16.636 |
| 0.7708333333333334 | 16.636 |
| 0.7715277777777777 | 12.257 |
| 0.7722222222222223 | 12.257 |
| 0.7729166666666667 | 12.257 |
| 0.7736111111111111 | 12.257 |
| 0.7743055555555555 | 12.257 |
| 0.775 | 12.257 |
| 0.7756944444444445 | 12.257 |
| 0.7763888888888889 | 7.887 |
| 0.7770833333333332 | 7.887 |
| 0.7777777777777778 | 7.887 |
| 0.7784722222222222 | 7.887 |
| 0.7791666666666667 | 3.525 |
| 0.779861111111111 | 3.525 |
| 0.7805555555555556 | 3.525 |
| 0.78125 | 3.525 |
| 0.7819444444444444 | 3.525 |
| 0.782638888888889 | 3.525 |
| 0.7833333333333333 | 3.525 |
| 0.7840277777777778 | 3.525 |
| 0.7847222222222222 | 0 |
| 0.7854166666666668 | 0 |
| 0.7861111111111111 | 0 |
| 0.7868055555555555 | 0 |
| 0.7875 | 0 |
| 0.7881944444444445 | 0 |
| 0.7888888888888889 | 0 |
| 0.7895833333333333 | 0 |
| 0.7902777777777777 | 0 |
| 0.7909722222222223 | 0 |
| 0.7916666666666666 | 0 |
| 0.7923611111111111 | 0 |
| 0.7930555555555556 | 0 |
| 0.7937500000000001 | 0 |
| 0.7944444444444444 | 0 |
| 0.7951388888888888 | 0 |
| 0.7958333333333334 | 0 |
| 0.7965277777777778 | 0 |
| 0.7972222222222222 | 0 |
| 0.7979166666666666 | 0 |
| 0.7986111111111112 | 0 |
| 0.7993055555555556 | 0 |
| 0.7999999999999999 | 0 |
| 0.8006944444444444 | 0 |
| 0.8013888888888889 | 0 |
| 0.8020833333333334 | 0 |
| 0.8027777777777777 | 0 |
| 0.8034722222222223 | 0 |
| 0.8041666666666667 | 0 |
| 0.8048611111111111 | 0 |
| 0.8055555555555555 | 0 |
| 0.80625 | 0 |
| 0.8069444444444445 | 0 |
| 0.8076388888888889 | 0 |
| 0.8083333333333332 | 0 |
| 0.8090277777777778 | 0 |
| 0.8097222222222222 | 0 |
| 0.8104166666666667 | 0 |
| 0.811111111111111 | 0 |
| 0.8118055555555556 | 0 |
| 0.8125 | 0 |
| 0.8131944444444444 | 0 |
| 0.813888888888889 | 0 |
| 0.8145833333333333 | 0 |
| 0.8152777777777778 | 0 |
| 0.8159722222222222 | 0 |
| 0.8166666666666668 | 0 |
| 0.8173611111111111 | 0 |
| 0.8180555555555555 | 0 |
| 0.81875 | 0 |
| 0.8194444444444445 | 0 |
| 0.8201388888888889 | 0 |
| 0.8208333333333333 | 0 |
| 0.8215277777777777 | 0 |
| 0.8222222222222223 | 0 |
| 0.8229166666666666 | 0 |
| 0.8236111111111111 | 0 |
| 0.8243055555555556 | 0 |
| 0.8250000000000001 | 0 |
| 0.8256944444444444 | 0 |
| 0.8263888888888888 | 0 |
| 0.8270833333333334 | 0 |
| 0.8277777777777778 | 0 |
| 0.8284722222222222 | 0 |
| 0.8291666666666666 | 0 |
| 0.8298611111111112 | 0 |
| 0.8305555555555556 | 0 |
| 0.8312499999999999 | 0 |
| 0.8319444444444444 | 0 |
| 0.8326388888888889 | 0 |
| 0.8333333333333334 | 0 |
| 0.8340277777777777 | 0 |
| 0.8347222222222223 | 0 |
| 0.8354166666666667 | 0 |
| 0.8361111111111111 | 0 |
| 0.8368055555555555 | 0 |
| 0.8375 | 0 |
| 0.8381944444444445 | 0 |
| 0.8388888888888889 | 0 |
| 0.8395833333333332 | 0 |
| 0.8402777777777778 | 0 |
| 0.8409722222222222 | 0 |
| 0.8416666666666667 | 0 |
| 0.842361111111111 | 0 |
| 0.8430555555555556 | 0 |
| 0.84375 | 0 |
| 0.8444444444444444 | 0 |
| 0.845138888888889 | 0 |
| 0.8458333333333333 | 0 |
| 0.8465277777777778 | 0 |
| 0.8472222222222222 | 0 |
| 0.8479166666666668 | 0 |
| 0.8486111111111111 | 0 |
| 0.8493055555555555 | 0 |
| 0.85 | 0 |
| 0.8506944444444445 | 0 |
| 0.8513888888888889 | 0 |
| 0.8520833333333333 | 0 |
| 0.8527777777777777 | 0 |
| 0.8534722222222223 | 0 |
| 0.8541666666666666 | 0 |
| 0.8548611111111111 | 0 |
| 0.8555555555555556 | 0 |
| 0.8562500000000001 | 0 |
| 0.8569444444444444 | 0 |
| 0.8576388888888888 | 0 |
| 0.8583333333333334 | 0 |
| 0.8590277777777778 | 0 |
| 0.8597222222222222 | 0 |
| 0.8604166666666666 | 0 |
| 0.8611111111111112 | 0 |
| 0.8618055555555556 | 0 |
| 0.8624999999999999 | 0 |
| 0.8631944444444444 | 0 |
| 0.8638888888888889 | 0 |
| 0.8645833333333334 | 0 |
| 0.8652777777777777 | 0 |
| 0.8659722222222223 | 0 |
| 0.8666666666666667 | 0 |
| 0.8673611111111111 | 0 |
| 0.8680555555555555 | 0 |
| 0.86875 | 0 |
| 0.8694444444444445 | 0 |
| 0.8701388888888889 | 0 |
| 0.8708333333333332 | 0 |
| 0.8715277777777778 | 0 |
| 0.8722222222222222 | 0 |
| 0.8729166666666667 | 0 |
| 0.873611111111111 | 0 |
| 0.8743055555555556 | 0 |
| 0.875 | 0 |
| 0.8756944444444444 | 0 |
| 0.876388888888889 | 0 |
| 0.8770833333333333 | 0 |
| 0.8777777777777778 | 0 |
| 0.8784722222222222 | 0 |
| 0.8791666666666668 | 0 |
| 0.8798611111111111 | 0 |
| 0.8805555555555555 | 0 |
| 0.88125 | 0 |
| 0.8819444444444445 | 0 |
| 0.8826388888888889 | 0 |
| 0.8833333333333333 | 0 |
| 0.8840277777777777 | 0 |
| 0.8847222222222223 | 0 |
| 0.8854166666666666 | 0 |
| 0.8861111111111111 | 0 |
| 0.8868055555555556 | 0 |
| 0.8875000000000001 | 0 |
| 0.8881944444444444 | 0 |
| 0.8888888888888888 | 0 |
| 0.8895833333333334 | 0 |
| 0.8902777777777778 | 0 |
| 0.8909722222222222 | 0 |
| 0.8916666666666666 | 0 |
| 0.8923611111111112 | 0 |
| 0.8930555555555556 | 0 |
| 0.8937499999999999 | 0 |
| 0.8944444444444444 | 0 |
| 0.8951388888888889 | 0 |
| 0.8958333333333334 | 0 |
| 0.8965277777777777 | 0 |
| 0.8972222222222223 | 0 |
| 0.8979166666666667 | 0 |
| 0.8986111111111111 | 0 |
| 0.8993055555555555 | 0 |
| 0.9 | 0 |
| 0.9006944444444445 | 0 |
| 0.9013888888888889 | 0 |
| 0.9020833333333332 | 0 |
| 0.9027777777777778 | 0 |
| 0.9034722222222222 | 0 |
| 0.9041666666666667 | 0 |
| 0.904861111111111 | 0 |
| 0.9055555555555556 | 0 |
| 0.90625 | 0 |
| 0.9069444444444444 | 0 |
| 0.907638888888889 | 0 |
| 0.9083333333333333 | 0 |
| 0.9090277777777778 | 0 |
| 0.9097222222222222 | 0 |
| 0.9104166666666668 | 0 |
| 0.9111111111111111 | 0 |
| 0.9118055555555555 | 0 |
| 0.9125 | 0 |
| 0.9131944444444445 | 0 |
| 0.9138888888888889 | 0 |
| 0.9145833333333333 | 0 |
| 0.9152777777777777 | 0 |
| 0.9159722222222223 | 0 |
| 0.9166666666666666 | 0 |
| 0.9173611111111111 | 0 |
| 0.9180555555555556 | 0 |
| 0.9187500000000001 | 0 |
| 0.9194444444444444 | 0 |
| 0.9201388888888888 | 0 |
| 0.9208333333333334 | 0 |
| 0.9215277777777778 | 0 |
| 0.9222222222222222 | 0 |
| 0.9229166666666666 | 0 |
| 0.9236111111111112 | 0 |
| 0.9243055555555556 | 0 |
| 0.9249999999999999 | 0 |
| 0.9256944444444444 | 0 |
| 0.9263888888888889 | 0 |
| 0.9270833333333334 | 0 |
| 0.9277777777777777 | 0 |
| 0.9284722222222223 | 0 |
| 0.9291666666666667 | 0 |
| 0.9298611111111111 | 0 |
| 0.9305555555555555 | 0 |
| 0.93125 | 0 |
| 0.9319444444444445 | 0 |
| 0.9326388888888889 | 0 |
| 0.9333333333333332 | 0 |
| 0.9340277777777778 | 0 |
| 0.9347222222222222 | 0 |
| 0.9354166666666667 | 0 |
| 0.936111111111111 | 0 |
| 0.9368055555555556 | 0 |
| 0.9375 | 0 |
| 0.9381944444444444 | 0 |
| 0.938888888888889 | 0 |
| 0.9395833333333333 | 0 |
| 0.9402777777777778 | 0 |
| 0.9409722222222222 | 0 |
| 0.9416666666666668 | 0 |
| 0.9423611111111111 | 0 |
| 0.9430555555555555 | 0 |
| 0.94375 | 0 |
| 0.9444444444444445 | 0 |
| 0.9451388888888889 | 0 |
| 0.9458333333333333 | 0 |
| 0.9465277777777777 | 0 |
| 0.9472222222222223 | 0 |
| 0.9479166666666666 | 0 |
| 0.9486111111111111 | 0 |
| 0.9493055555555556 | 0 |
| 0.9500000000000001 | 0 |
| 0.9506944444444444 | 0 |
| 0.9513888888888888 | 0 |
| 0.9520833333333334 | 0 |
| 0.9527777777777778 | 0 |
| 0.9534722222222222 | 0 |
| 0.9541666666666666 | 0 |
| 0.9548611111111112 | 0 |
| 0.9555555555555556 | 0 |
| 0.9562499999999999 | 0 |
| 0.9569444444444444 | 0 |
| 0.9576388888888889 | 0 |
| 0.9583333333333334 | 0 |
| 0.9590277777777777 | 0 |
| 0.9597222222222223 | 0 |
| 0.9604166666666667 | 0 |
| 0.9611111111111111 | 0 |
| 0.9618055555555555 | 0 |
| 0.9625 | 0 |
| 0.9631944444444445 | 0 |
| 0.9638888888888889 | 0 |
| 0.9645833333333332 | 0 |
| 0.9652777777777778 | 0 |
| 0.9659722222222222 | 0 |
| 0.9666666666666667 | 0 |
| 0.967361111111111 | 0 |
| 0.9680555555555556 | 0 |
| 0.96875 | 0 |
| 0.9694444444444444 | 0 |
| 0.970138888888889 | 0 |
| 0.9708333333333333 | 0 |
| 0.9715277777777778 | 0 |
| 0.9722222222222222 | 0 |
| 0.9729166666666668 | 0 |
| 0.9736111111111111 | 0 |
| 0.9743055555555555 | 0 |
| 0.975 | 0 |
| 0.9756944444444445 | 0 |
| 0.9763888888888889 | 0 |
| 0.9770833333333333 | 0 |
| 0.9777777777777777 | 0 |
| 0.9784722222222223 | 0 |
| 0.9791666666666666 | 0 |
| 0.9798611111111111 | 0 |
| 0.9805555555555556 | 0 |
| 0.9812500000000001 | 0 |
| 0.9819444444444444 | 0 |
| 0.9826388888888888 | 0 |
| 0.9833333333333334 | 0 |
| 0.9840277777777778 | 0 |
| 0.9847222222222222 | 0 |
| 0.9854166666666666 | 0 |
| 0.9861111111111112 | 0 |
| 0.9868055555555556 | 0 |
| 0.9874999999999999 | 0 |
| 0.9881944444444444 | 0 |
| 0.9888888888888889 | 0 |
| 0.9895833333333334 | 0 |
| 0.9902777777777777 | 0 |
| 0.9909722222222223 | 0 |
| 0.9916666666666667 | 0 |
| 0.9923611111111111 | 0 |
| 0.9930555555555555 | 0 |
| 0.99375 | 0 |
| 0.9944444444444445 | 0 |
| 0.9951388888888889 | 0 |
| 0.9958333333333332 | 0 |
| 0.9965277777777778 | 0 |
| 0.9972222222222222 | 0 |
| 0.9979166666666667 | 0 |
| 0.998611111111111 | 0 |
| 0.9993055555555556 | 0 |